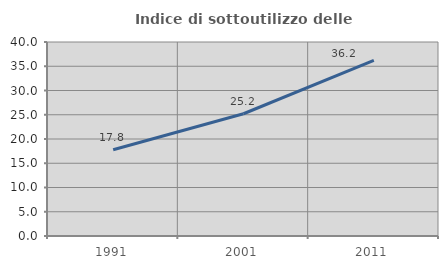
| Category | Indice di sottoutilizzo delle abitazioni  |
|---|---|
| 1991.0 | 17.773 |
| 2001.0 | 25.207 |
| 2011.0 | 36.234 |